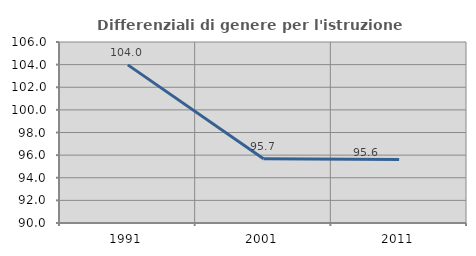
| Category | Differenziali di genere per l'istruzione superiore |
|---|---|
| 1991.0 | 103.979 |
| 2001.0 | 95.68 |
| 2011.0 | 95.606 |